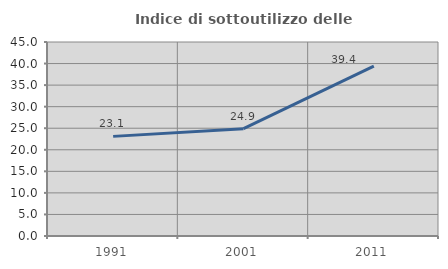
| Category | Indice di sottoutilizzo delle abitazioni  |
|---|---|
| 1991.0 | 23.109 |
| 2001.0 | 24.898 |
| 2011.0 | 39.405 |